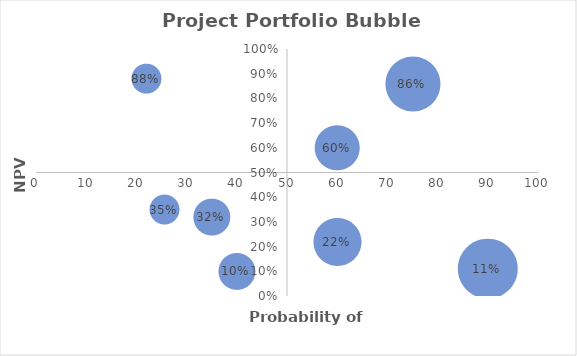
| Category | Sample Data for Project Portfolio Bubble Chart  |
|---|---|
| 40.0 | 0.1 |
| 25.6 | 0.35 |
| 22.0 | 0.88 |
| 60.0 | 0.22 |
| 75.0 | 0.86 |
| 35.0 | 0.32 |
| 90.0 | 0.11 |
| 60.0 | 0.6 |